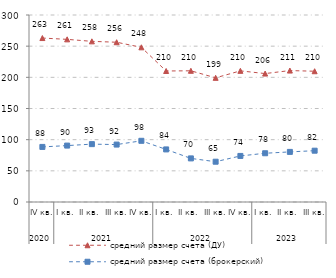
| Category | средний размер счета (ДУ) | средний размер счета (брокерский) |
|---|---|---|
| 0 | 263.022 | 88.378 |
| 1 | 260.93 | 90.496 |
| 2 | 257.735 | 92.83 |
| 3 | 256.302 | 92.137 |
| 4 | 248.139 | 98.17 |
| 5 | 210.169 | 84.356 |
| 6 | 210.495 | 69.946 |
| 7 | 199.204 | 64.633 |
| 8 | 210.396 | 73.898 |
| 9 | 206.035 | 78.208 |
| 10 | 210.852 | 80.377 |
| 11 | 209.779 | 82.319 |